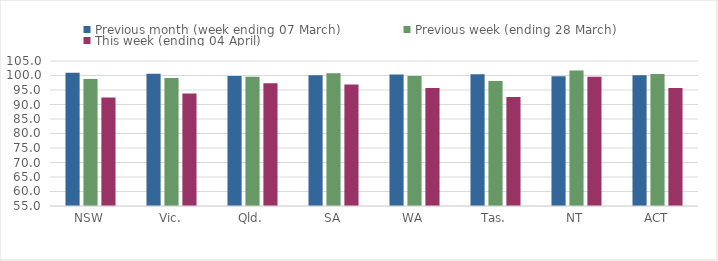
| Category | Previous month (week ending 07 March) | Previous week (ending 28 March) | This week (ending 04 April) |
|---|---|---|---|
| NSW | 100.931 | 98.803 | 92.414 |
| Vic. | 100.615 | 99.158 | 93.751 |
| Qld. | 99.842 | 99.559 | 97.368 |
| SA | 100.061 | 100.769 | 96.923 |
| WA | 100.31 | 99.859 | 95.701 |
| Tas. | 100.393 | 98.097 | 92.6 |
| NT | 99.78 | 101.762 | 99.604 |
| ACT | 100.095 | 100.54 | 95.712 |